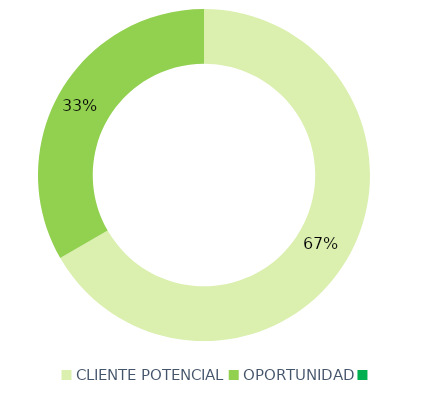
| Category | Series 0 |
|---|---|
| CLIENTE POTENCIAL | 44 |
| OPORTUNIDAD | 22 |